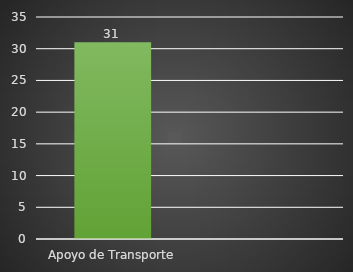
| Category | INDICADOR  |
|---|---|
| Apoyo de Transporte | 31 |